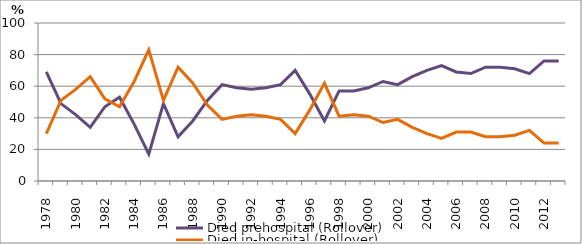
| Category | Died prehospital (Rollover) | Died in-hospital (Rollover) |
|---|---|---|
| 1978.0 | 69 | 30 |
| 1979.0 | 49 | 51 |
| 1980.0 | 42 | 58 |
| 1981.0 | 34 | 66 |
| 1982.0 | 47 | 52 |
| 1983.0 | 53 | 47 |
| 1984.0 | 36 | 63 |
| 1985.0 | 17 | 83 |
| 1986.0 | 49 | 51 |
| 1987.0 | 28 | 72 |
| 1988.0 | 38 | 62 |
| 1989.0 | 51 | 48 |
| 1990.0 | 61 | 39 |
| 1991.0 | 59 | 41 |
| 1992.0 | 58 | 42 |
| 1993.0 | 59 | 41 |
| 1994.0 | 61 | 39 |
| 1995.0 | 70 | 30 |
| 1996.0 | 55 | 45 |
| 1997.0 | 38 | 62 |
| 1998.0 | 57 | 41 |
| 1999.0 | 57 | 42 |
| 2000.0 | 59 | 41 |
| 2001.0 | 63 | 37 |
| 2002.0 | 61 | 39 |
| 2003.0 | 66 | 34 |
| 2004.0 | 70 | 30 |
| 2005.0 | 73 | 27 |
| 2006.0 | 69 | 31 |
| 2007.0 | 68 | 31 |
| 2008.0 | 72 | 28 |
| 2009.0 | 72 | 28 |
| 2010.0 | 71 | 29 |
| 2011.0 | 68 | 32 |
| 2012.0 | 76 | 24 |
| 2013.0 | 76 | 24 |